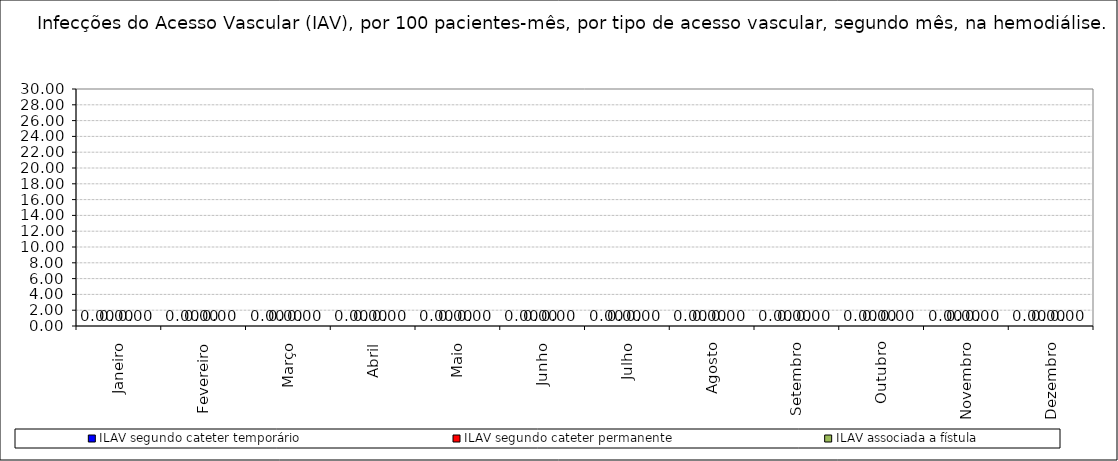
| Category | ILAV segundo cateter temporário | ILAV segundo cateter permanente | ILAV associada a fístula |
|---|---|---|---|
| Janeiro | 0 | 0 | 0 |
| Fevereiro | 0 | 0 | 0 |
| Março | 0 | 0 | 0 |
| Abril | 0 | 0 | 0 |
| Maio | 0 | 0 | 0 |
| Junho | 0 | 0 | 0 |
| Julho | 0 | 0 | 0 |
| Agosto | 0 | 0 | 0 |
| Setembro | 0 | 0 | 0 |
| Outubro | 0 | 0 | 0 |
| Novembro | 0 | 0 | 0 |
| Dezembro | 0 | 0 | 0 |